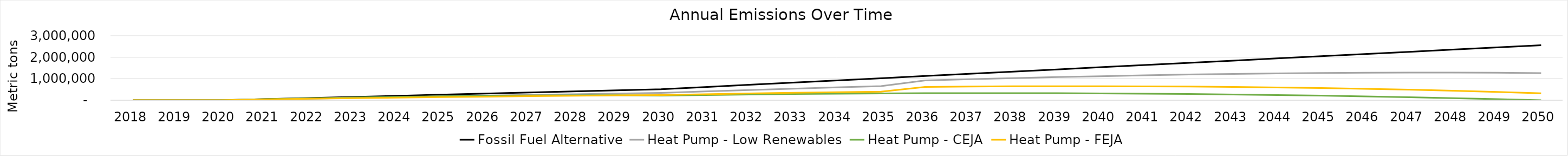
| Category | Fossil Fuel Alternative | Heat Pump - Low Renewables | Heat Pump - CEJA | Heat Pump - FEJA |
|---|---|---|---|---|
| 2018.0 | 0 | 0 | 0 | 0 |
| 2019.0 | 0 | 0 | 0 | 0 |
| 2020.0 | 0 | 0 | 0 | 0 |
| 2021.0 | 51197.381 | 36136.398 | 48140.9 | 34775.481 |
| 2022.0 | 102394.763 | 71940.791 | 90732.547 | 66512.026 |
| 2023.0 | 153592.144 | 107389.399 | 127774.94 | 95209.637 |
| 2024.0 | 204789.525 | 142456.418 | 159268.08 | 120868.312 |
| 2025.0 | 255986.906 | 177113.857 | 185211.967 | 143488.052 |
| 2026.0 | 307184.288 | 211331.369 | 205606.599 | 166846.777 |
| 2027.0 | 358381.669 | 245076.058 | 220451.979 | 188425.873 |
| 2028.0 | 409579.05 | 278312.282 | 229748.105 | 208225.341 |
| 2029.0 | 460776.431 | 311001.435 | 233494.977 | 226245.181 |
| 2030.0 | 511973.813 | 343101.712 | 211145.871 | 242485.391 |
| 2031.0 | 614368.575 | 408619.486 | 240706.293 | 280304.699 |
| 2032.0 | 716763.338 | 472909.401 | 266043.798 | 314564.749 |
| 2033.0 | 819158.1 | 535874.327 | 287158.385 | 345265.542 |
| 2034.0 | 921552.863 | 597409.06 | 304050.055 | 372407.079 |
| 2035.0 | 1023947.625 | 657399.68 | 316718.807 | 395989.358 |
| 2036.0 | 1126342.388 | 919936.888 | 325164.642 | 620226.398 |
| 2037.0 | 1228737.15 | 977128.649 | 329387.559 | 637359.61 |
| 2038.0 | 1331131.913 | 1029392.584 | 329387.559 | 647950.988 |
| 2039.0 | 1433526.675 | 1076572.548 | 325164.642 | 652000.532 |
| 2040.0 | 1535921.438 | 1118499.705 | 316718.807 | 649508.242 |
| 2041.0 | 1638316.2 | 1159231.712 | 304050.055 | 644714.281 |
| 2042.0 | 1740710.963 | 1194861.19 | 287158.385 | 633908.506 |
| 2043.0 | 1843105.725 | 1225175.034 | 266043.798 | 617090.918 |
| 2044.0 | 1945500.488 | 1249943.05 | 240706.293 | 594261.516 |
| 2045.0 | 2047895.25 | 1268916.645 | 211145.871 | 565420.3 |
| 2046.0 | 2150290.013 | 1281827.408 | 177362.532 | 530567.27 |
| 2047.0 | 2252684.775 | 1288385.602 | 139356.275 | 489702.427 |
| 2048.0 | 2355079.538 | 1288278.53 | 97127.101 | 442825.769 |
| 2049.0 | 2457474.3 | 1277125.115 | 50675.009 | 385893.632 |
| 2050.0 | 2559869.063 | 1258268.057 | 0 | 322612.708 |